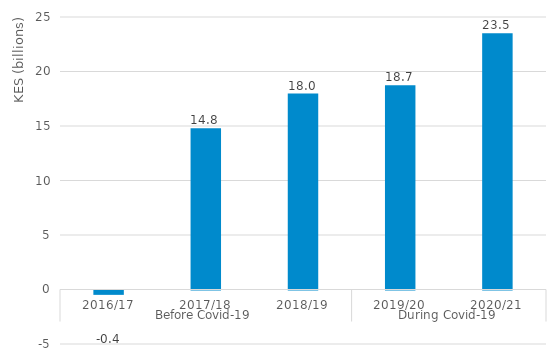
| Category | Social protection |
|---|---|
| 0 | -0.4 |
| 1 | 14.8 |
| 2 | 17.978 |
| 3 | 18.735 |
| 4 | 23.507 |